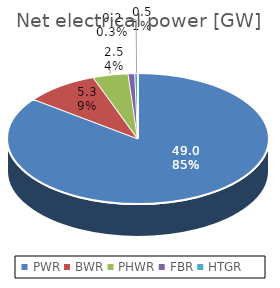
| Category | Net electrical power [GW] |
|---|---|
| PWR | 48.998 |
| BWR | 5.253 |
| PHWR | 2.52 |
| FBR | 0.47 |
| HTGR | 0.2 |